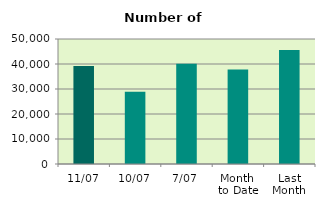
| Category | Series 0 |
|---|---|
| 11/07 | 39248 |
| 10/07 | 28852 |
| 7/07 | 40062 |
| Month 
to Date | 37772 |
| Last
Month | 45645.364 |